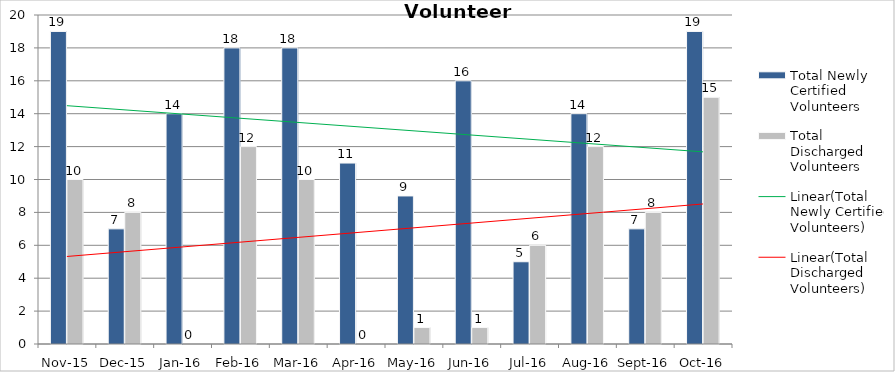
| Category | Total Newly Certified Volunteers | Total Discharged Volunteers |
|---|---|---|
| Nov-15 | 19 | 10 |
| Dec-15 | 7 | 8 |
| Jan-16 | 14 | 0 |
| Feb-16 | 18 | 12 |
| Mar-16 | 18 | 10 |
| Apr-16 | 11 | 0 |
| May-16 | 9 | 1 |
| Jun-16 | 16 | 1 |
| Jul-16 | 5 | 6 |
| Aug-16 | 14 | 12 |
| Sep-16 | 7 | 8 |
| Oct-16 | 19 | 15 |